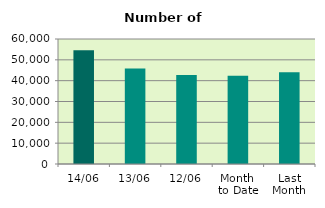
| Category | Series 0 |
|---|---|
| 14/06 | 54558 |
| 13/06 | 45852 |
| 12/06 | 42692 |
| Month 
to Date | 42399.2 |
| Last
Month | 44009.364 |